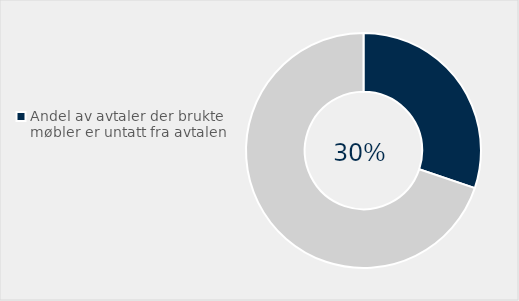
| Category | Series 0 |
|---|---|
| Andel av avtaler der brukte møbler er untatt fra avtalen | 0.302 |
| Ikke stilt krav  | 0.698 |